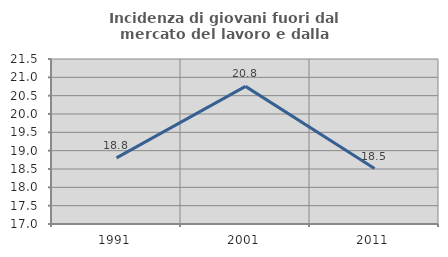
| Category | Incidenza di giovani fuori dal mercato del lavoro e dalla formazione  |
|---|---|
| 1991.0 | 18.804 |
| 2001.0 | 20.753 |
| 2011.0 | 18.512 |